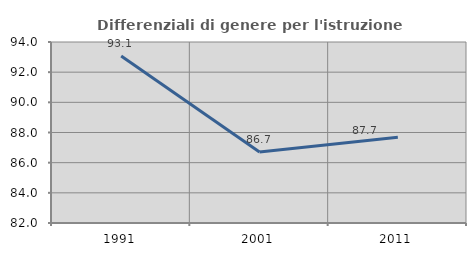
| Category | Differenziali di genere per l'istruzione superiore |
|---|---|
| 1991.0 | 93.076 |
| 2001.0 | 86.71 |
| 2011.0 | 87.682 |